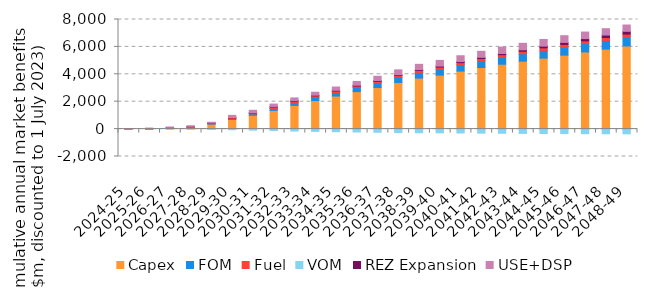
| Category | Capex | FOM | Fuel | VOM | REZ Expansion | USE+DSP |
|---|---|---|---|---|---|---|
| 2024-25 | 0 | 0 | 23.369 | 0.944 | 0.434 | 0.061 |
| 2025-26 | 12.456 | 1.276 | 35.453 | 1.422 | 1.562 | 0.131 |
| 2026-27 | 64.651 | 7.327 | 50.897 | 1.494 | 2.262 | 1.004 |
| 2027-28 | 120.912 | 13.814 | 59.557 | 2.035 | 4.545 | 30.745 |
| 2028-29 | 362.521 | 31.811 | 50.713 | -13.382 | 10.405 | 43.213 |
| 2029-30 | 701.035 | 69.104 | 52.438 | -41.825 | 18.485 | 161.651 |
| 2030-31 | 1007.97 | 100.461 | 72.826 | -74.26 | 26.091 | 165.476 |
| 2031-32 | 1366.689 | 141.501 | 109.503 | -104.071 | 35.462 | 172.562 |
| 2032-33 | 1731.873 | 186.165 | 125.402 | -139.443 | 43.485 | 188.877 |
| 2033-34 | 2083.152 | 225.683 | 120.09 | -166.251 | 45.858 | 215.087 |
| 2034-35 | 2410.253 | 262.873 | 110.609 | -188.258 | 48.813 | 239.411 |
| 2035-36 | 2735.297 | 297.327 | 115.189 | -210.902 | 54.749 | 274.814 |
| 2036-37 | 3033.334 | 329.35 | 116.89 | -232.348 | 61.232 | 312.496 |
| 2037-38 | 3404.323 | 375.557 | 131.537 | -251.723 | 56.126 | 355.447 |
| 2038-39 | 3722.437 | 412.007 | 142.264 | -264.797 | 61.393 | 389.01 |
| 2039-40 | 3939.994 | 429.97 | 159.131 | -272.821 | 70.988 | 414.941 |
| 2040-41 | 4232.766 | 463.121 | 155.134 | -283.49 | 76.37 | 426.626 |
| 2041-42 | 4494.197 | 492.21 | 167.923 | -294.077 | 82.117 | 443.328 |
| 2042-43 | 4734.828 | 518.466 | 177.862 | -305.122 | 88.544 | 461.203 |
| 2043-44 | 4959.062 | 540.855 | 182.142 | -312.482 | 106.822 | 474.293 |
| 2044-45 | 5178.521 | 563.324 | 190.564 | -319.555 | 124.072 | 484.067 |
| 2045-46 | 5397.964 | 585.924 | 197.23 | -326.91 | 145.716 | 488.989 |
| 2046-47 | 5630.215 | 611.59 | 200.44 | -333.073 | 163.287 | 478.108 |
| 2047-48 | 5838.298 | 634.133 | 210.974 | -337.864 | 181.346 | 463.423 |
| 2048-49 | 6067.945 | 659.734 | 207.358 | -343.085 | 199.629 | 462.351 |